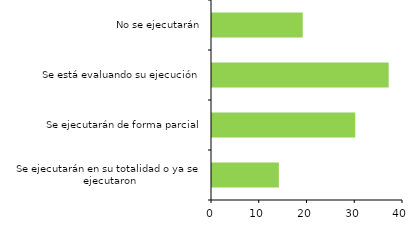
| Category | Series 0 |
|---|---|
| Se ejecutarán en su totalidad o ya se ejecutaron | 14 |
| Se ejecutarán de forma parcial | 30 |
| Se está evaluando su ejecución | 37 |
| No se ejecutarán | 19 |